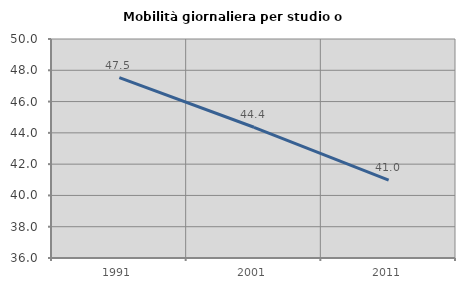
| Category | Mobilità giornaliera per studio o lavoro |
|---|---|
| 1991.0 | 47.526 |
| 2001.0 | 44.356 |
| 2011.0 | 40.98 |